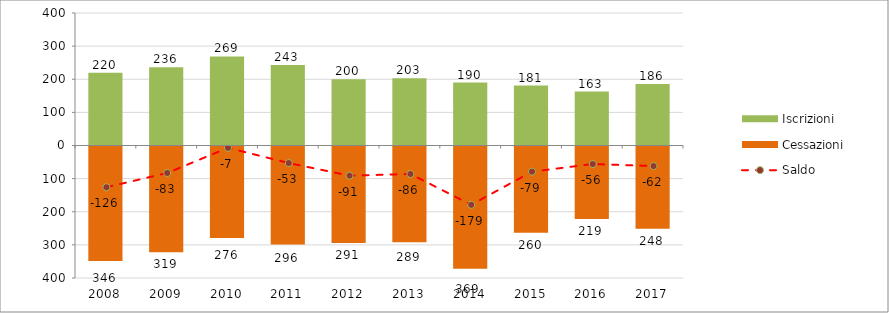
| Category | Iscrizioni | Cessazioni |
|---|---|---|
| 2008.0 | 220 | -346 |
| 2009.0 | 236 | -319 |
| 2010.0 | 269 | -276 |
| 2011.0 | 243 | -296 |
| 2012.0 | 200 | -291 |
| 2013.0 | 203 | -289 |
| 2014.0 | 190 | -369 |
| 2015.0 | 181 | -260 |
| 2016.0 | 163 | -219 |
| 2017.0 | 186 | -248 |